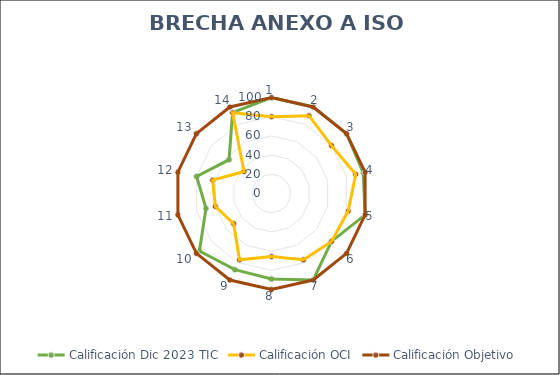
| Category | Calificación Dic 2023 TIC | Calificación OCI | Calificación Objetivo |
|---|---|---|---|
| 0 | 100 | 80 | 100 |
| 1 | 100 | 90 | 100 |
| 2 | 100 | 80 | 100 |
| 3 | 98 | 90 | 100 |
| 4 | 100 | 82 | 100 |
| 5 | 80 | 80 | 100 |
| 6 | 100 | 76.667 | 100 |
| 7 | 89 | 65.714 | 100 |
| 8 | 88 | 76.667 | 100 |
| 9 | 96 | 50.37 | 100 |
| 10 | 70 | 60 | 100 |
| 11 | 80 | 62.857 | 100 |
| 12 | 56.5 | 36.667 | 100 |
| 13 | 93.5 | 93.333 | 100 |